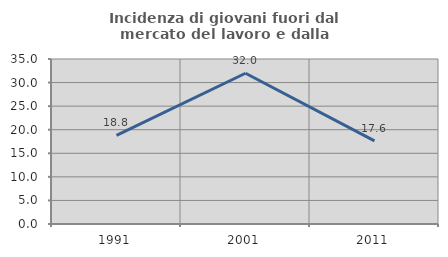
| Category | Incidenza di giovani fuori dal mercato del lavoro e dalla formazione  |
|---|---|
| 1991.0 | 18.803 |
| 2001.0 | 31.975 |
| 2011.0 | 17.647 |